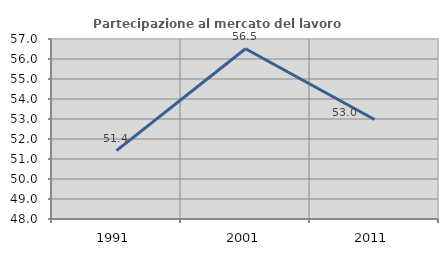
| Category | Partecipazione al mercato del lavoro  femminile |
|---|---|
| 1991.0 | 51.421 |
| 2001.0 | 56.511 |
| 2011.0 | 52.974 |